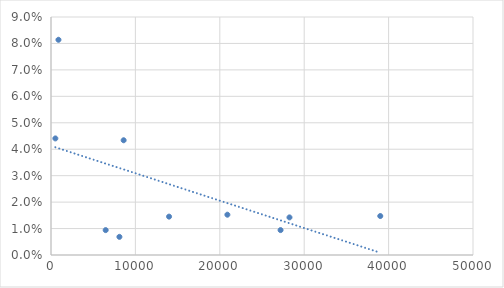
| Category | AAGR |
|---|---|
| 39014.204109084 | 0.015 |
| 27199.939969537045 | 0.009 |
| 28256.10622097309 | 0.014 |
| 6479.076885612454 | 0.009 |
| 8105.88818359375 | 0.007 |
| 13987.965137403879 | 0.015 |
| 517.4201977739443 | 0.044 |
| 883.7625941059046 | 0.081 |
| 20898.8365495899 | 0.015 |
| 8608.0 | 0.043 |